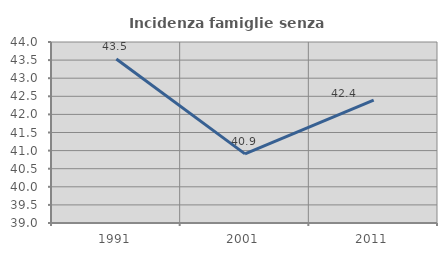
| Category | Incidenza famiglie senza nuclei |
|---|---|
| 1991.0 | 43.529 |
| 2001.0 | 40.909 |
| 2011.0 | 42.391 |